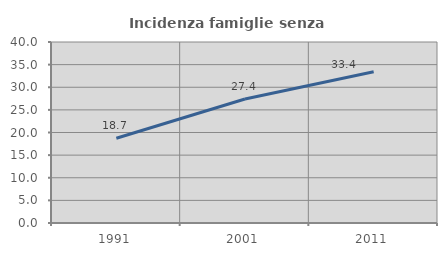
| Category | Incidenza famiglie senza nuclei |
|---|---|
| 1991.0 | 18.738 |
| 2001.0 | 27.414 |
| 2011.0 | 33.443 |